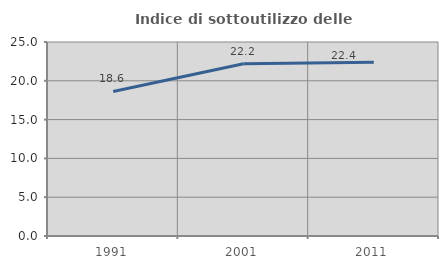
| Category | Indice di sottoutilizzo delle abitazioni  |
|---|---|
| 1991.0 | 18.627 |
| 2001.0 | 22.203 |
| 2011.0 | 22.388 |